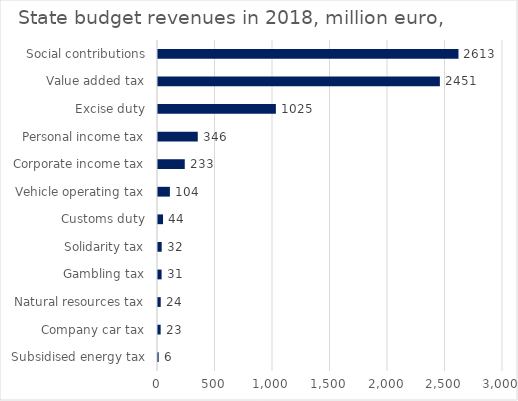
| Category | 2018 |
|---|---|
| Social contributions | 2612.774 |
| Value added tax | 2451.139 |
| Excise duty | 1025.025 |
| Personal income tax | 345.76 |
| Corporate income tax | 232.7 |
| Vehicle operating tax | 103.5 |
| Customs duty | 43.8 |
| Solidarity tax | 32.025 |
| Gambling tax | 31.28 |
| Natural resources tax | 23.78 |
| Company car tax | 23.1 |
| Subsidised energy tax | 5.803 |